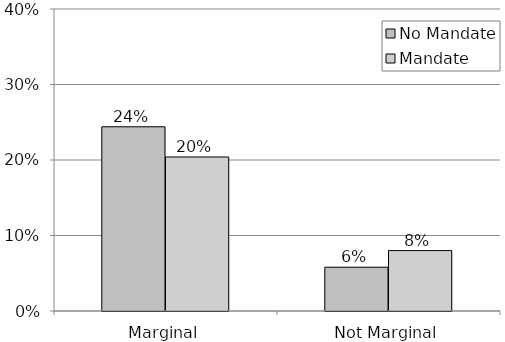
| Category | No Mandate | Mandate |
|---|---|---|
| Marginal | 0.244 | 0.204 |
| Not Marginal | 0.058 | 0.08 |